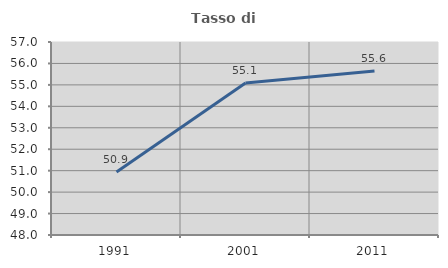
| Category | Tasso di occupazione   |
|---|---|
| 1991.0 | 50.94 |
| 2001.0 | 55.088 |
| 2011.0 | 55.648 |